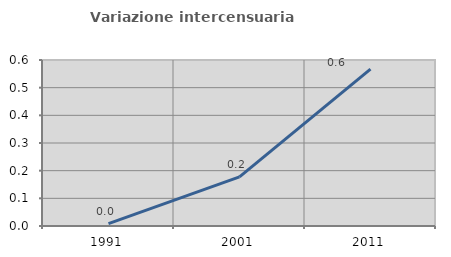
| Category | Variazione intercensuaria annua |
|---|---|
| 1991.0 | 0.009 |
| 2001.0 | 0.177 |
| 2011.0 | 0.567 |